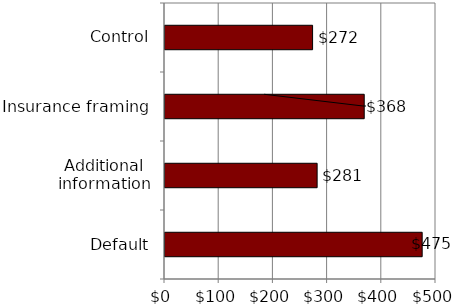
| Category | Series 0 |
|---|---|
| Default | 474.5 |
| Additional information | 280.68 |
| Insurance framing | 367.57 |
| Control | 272.3 |